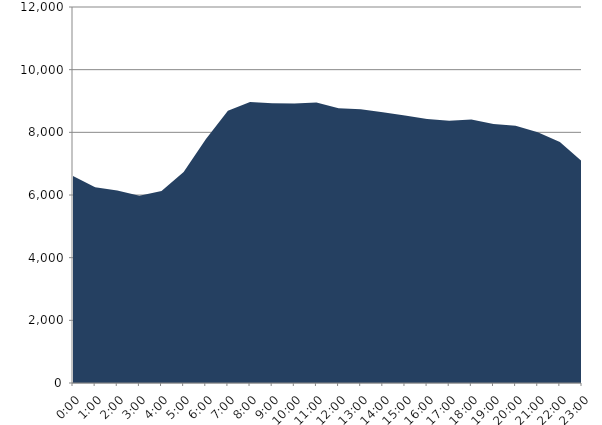
| Category | Series 0 | Series 1 |
|---|---|---|
| 2016-05-18 |  | 6605.048 |
| 2016-05-18 01:00:00 |  | 6248.98 |
| 2016-05-18 02:00:00 |  | 6141.161 |
| 2016-05-18 03:00:00 |  | 5978.457 |
| 2016-05-18 04:00:00 |  | 6125.675 |
| 2016-05-18 05:00:00 |  | 6735.157 |
| 2016-05-18 06:00:00 |  | 7778.602 |
| 2016-05-18 07:00:00 |  | 8690.132 |
| 2016-05-18 08:00:00 |  | 8964.171 |
| 2016-05-18 09:00:00 |  | 8926.303 |
| 2016-05-18 10:00:00 |  | 8920.198 |
| 2016-05-18 11:00:00 |  | 8955.943 |
| 2016-05-18 12:00:00 |  | 8765.884 |
| 2016-05-18 13:00:00 |  | 8736.734 |
| 2016-05-18 14:00:00 |  | 8643.064 |
| 2016-05-18 15:00:00 |  | 8540.759 |
| 2016-05-18 16:00:00 |  | 8423.106 |
| 2016-05-18 17:00:00 |  | 8371.611 |
| 2016-05-18 18:00:00 |  | 8407.696 |
| 2016-05-18 19:00:00 |  | 8269.271 |
| 2016-05-18 20:00:00 |  | 8210.242 |
| 2016-05-18 21:00:00 |  | 8004.338 |
| 2016-05-18 22:00:00 |  | 7690.294 |
| 2016-05-18 23:00:00 |  | 7076.307 |